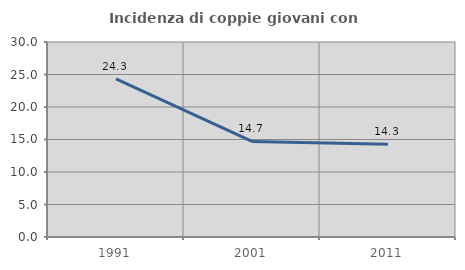
| Category | Incidenza di coppie giovani con figli |
|---|---|
| 1991.0 | 24.314 |
| 2001.0 | 14.703 |
| 2011.0 | 14.268 |